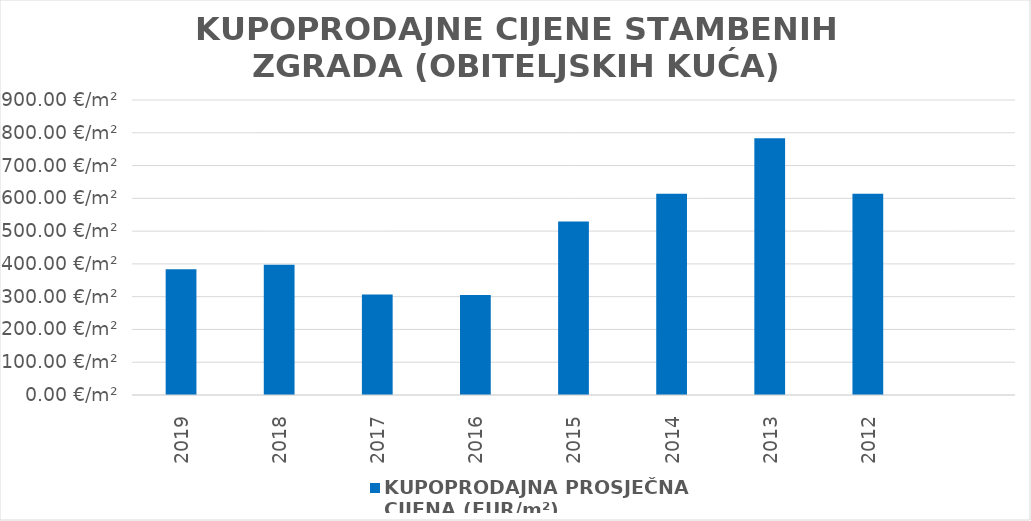
| Category | KUPOPRODAJNA PROSJEČNA 
CIJENA (EUR/m²) |
|---|---|
| 2019 | 1901-01-17 07:54:28 |
| 2018 | 1901-01-31 02:06:33 |
| 2017 | 1900-11-01 17:33:33 |
| 2016 | 1900-10-31 03:52:56 |
| 2015 | 1901-06-12 00:36:27 |
| 2014 | 1901-09-05 06:59:13 |
| 2013 | 1902-02-21 00:44:03 |
| 2012 | 1901-09-05 02:14:19 |